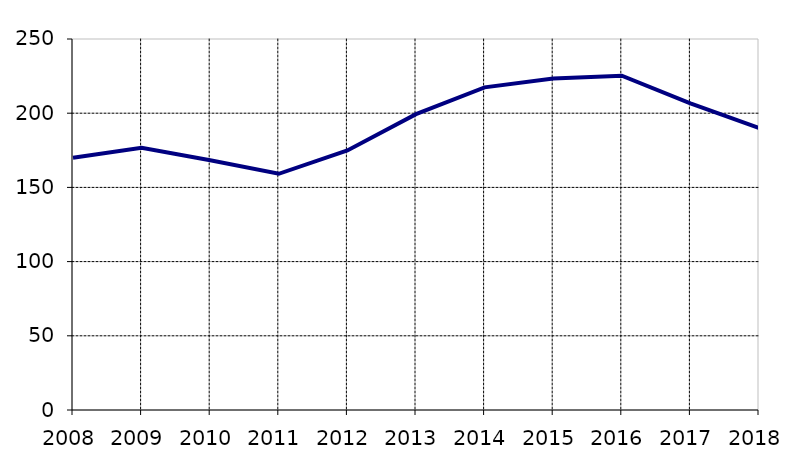
| Category | Series 0 |
|---|---|
| 2008.0 | 170.048 |
| 2009.0 | 176.771 |
| 2010.0 | 168.251 |
| 2011.0 | 159.178 |
| 2012.0 | 174.859 |
| 2013.0 | 199.343 |
| 2014.0 | 217.4 |
| 2015.0 | 223.45 |
| 2016.0 | 225.244 |
| 2017.0 | 206.618 |
| 2018.0 | 190.035 |